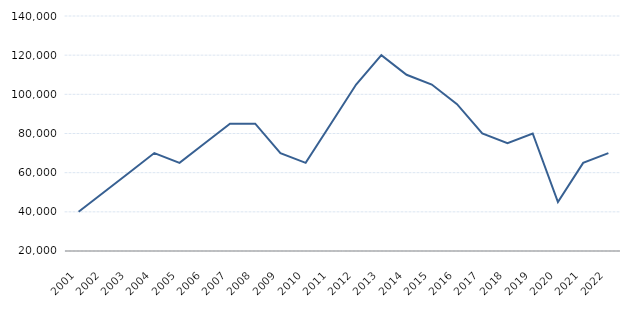
| Category | Series 1 |
|---|---|
| 2001.0 | 40000 |
| 2002.0 | 50000 |
| 2003.0 | 60000 |
| 2004.0 | 70000 |
| 2005.0 | 65000 |
| 2006.0 | 75000 |
| 2007.0 | 85000 |
| 2008.0 | 85000 |
| 2009.0 | 70000 |
| 2010.0 | 65000 |
| 2011.0 | 85000 |
| 2012.0 | 105000 |
| 2013.0 | 120000 |
| 2014.0 | 110000 |
| 2015.0 | 105000 |
| 2016.0 | 95000 |
| 2017.0 | 80000 |
| 2018.0 | 75000 |
| 2019.0 | 80000 |
| 2020.0 | 45000 |
| 2021.0 | 65000 |
| 2022.0 | 70000 |